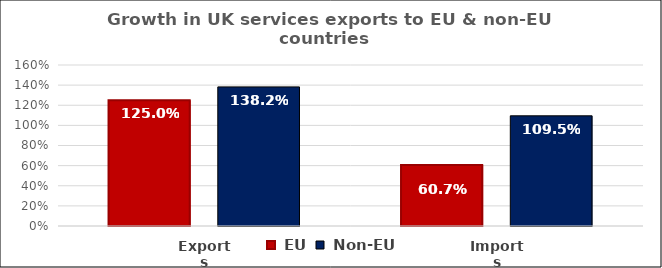
| Category |  EU |  Non-EU |
|---|---|---|
| Exports | 1.25 | 1.382 |
| Imports | 0.607 | 1.095 |